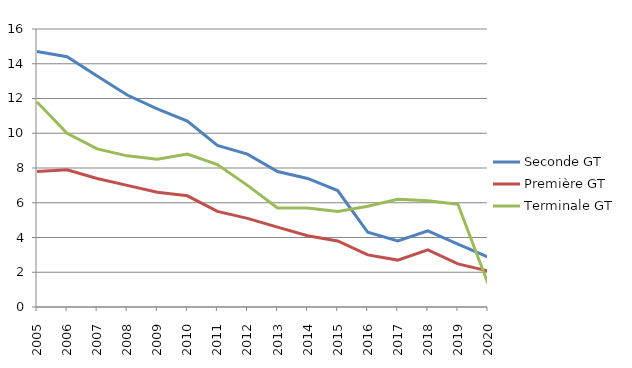
| Category | Seconde GT | Première GT | Terminale GT |
|---|---|---|---|
| 2005.0 | 14.7 | 7.8 | 11.8 |
| 2006.0 | 14.4 | 7.9 | 10 |
| 2007.0 | 13.3 | 7.4 | 9.1 |
| 2008.0 | 12.2 | 7 | 8.7 |
| 2009.0 | 11.4 | 6.6 | 8.5 |
| 2010.0 | 10.7 | 6.4 | 8.8 |
| 2011.0 | 9.3 | 5.5 | 8.2 |
| 2012.0 | 8.8 | 5.1 | 7 |
| 2013.0 | 7.8 | 4.6 | 5.7 |
| 2014.0 | 7.4 | 4.1 | 5.7 |
| 2015.0 | 6.7 | 3.8 | 5.5 |
| 2016.0 | 4.3 | 3 | 5.8 |
| 2017.0 | 3.8 | 2.7 | 6.2 |
| 2018.0 | 4.38 | 3.29 | 6.12 |
| 2019.0 | 3.62 | 2.48 | 5.91 |
| 2020.0 | 2.87 | 2.07 | 1.35 |